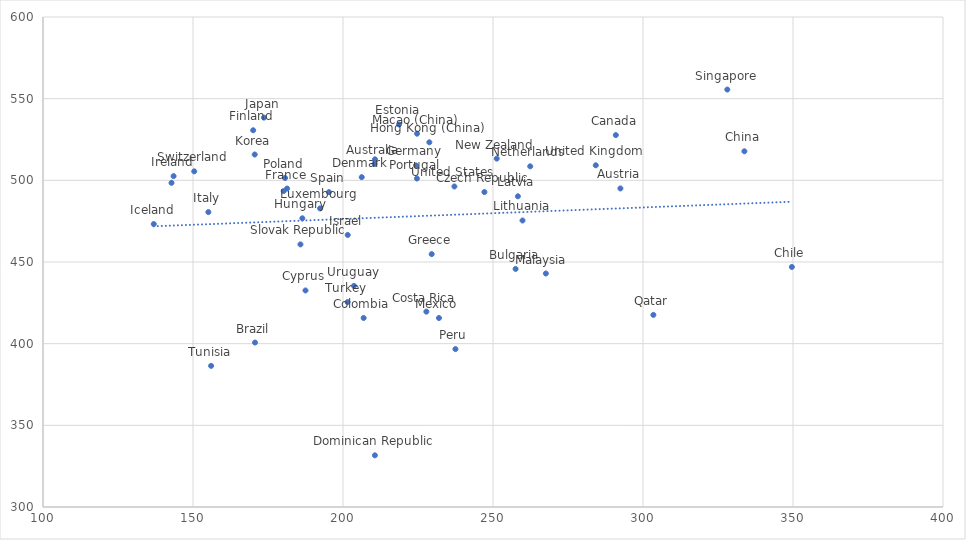
| Category | Series 0 |
|---|---|
| 210.545711827166 | 509.994 |
| 292.471347542304 | 495.037 |
| 170.667543226354 | 400.682 |
| 257.533516922205 | 445.772 |
| 290.944460494662 | 527.705 |
| 349.625940150624 | 446.956 |
| 333.800120242437 | 517.779 |
| 206.884489739776 | 415.729 |
| 227.786421457437 | 419.608 |
| 187.49128690053 | 432.577 |
| 247.141276906455 | 492.83 |
| 206.244441799309 | 501.937 |
| 210.625718033928 | 331.639 |
| 218.680726426649 | 534.194 |
| 170.056892166741 | 530.661 |
| 181.365923496175 | 494.978 |
| 224.323116631205 | 509.141 |
| 229.562081117229 | 454.829 |
| 228.784866905872 | 523.277 |
| 186.451328849067 | 476.748 |
| 136.927845794063 | 473.23 |
| 143.527988472201 | 502.575 |
| 201.57313117071 | 466.553 |
| 155.118352691436 | 480.547 |
| 173.654887188014 | 538.395 |
| 170.569538179651 | 515.81 |
| 258.294974002045 | 490.225 |
| 259.840990493139 | 475.409 |
| 192.354433249739 | 482.806 |
| 224.681870619999 | 528.55 |
| 267.615654576739 | 442.948 |
| 231.988555203075 | 415.71 |
| 262.406486635378 | 508.575 |
| 251.239931023911 | 513.304 |
| 142.835244504346 | 498.481 |
| 237.475159716642 | 396.684 |
| 180.682877957169 | 501.435 |
| 224.635379158172 | 501.1 |
| 303.45853997681 | 417.611 |
| 328.10162440868 | 555.575 |
| 185.816727700127 | 460.775 |
| 210.660563495916 | 512.864 |
| 195.321568357972 | 492.786 |
| 180.222216591178 | 493.422 |
| 150.407459418625 | 505.506 |
| 156.035336556656 | 386.403 |
| 201.523340191586 | 425.49 |
| 284.258598204864 | 509.222 |
| 237.136582741559 | 496.242 |
| 203.660621267363 | 435.363 |